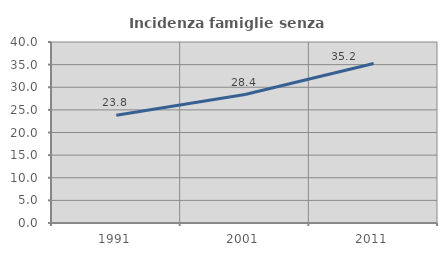
| Category | Incidenza famiglie senza nuclei |
|---|---|
| 1991.0 | 23.835 |
| 2001.0 | 28.388 |
| 2011.0 | 35.25 |